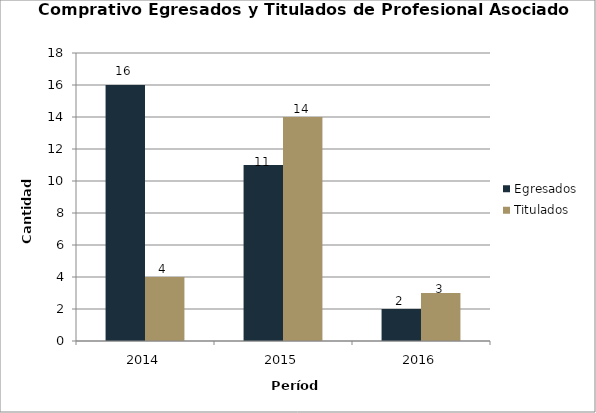
| Category | Egresados | Titulados |
|---|---|---|
| 2014.0 | 16 | 4 |
| 2015.0 | 11 | 14 |
| 2016.0 | 2 | 3 |